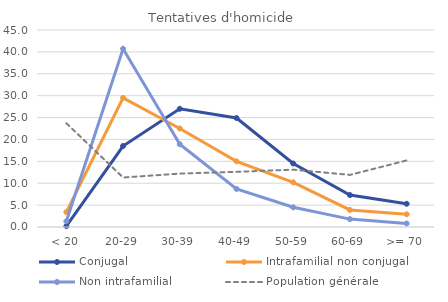
| Category | Conjugal | Intrafamilial non conjugal | Non intrafamilial | Population générale |
|---|---|---|---|---|
| < 20 | 0.2 | 3.4 | 1.3 | 23.7 |
| 20-29 | 18.5 | 29.5 | 40.7 | 11.3 |
| 30-39 | 27 | 22.5 | 18.9 | 12.2 |
| 40-49 | 24.9 | 15 | 8.7 | 12.6 |
| 50-59 | 14.5 | 10.2 | 4.5 | 13.1 |
| 60-69 | 7.3 | 3.9 | 1.8 | 11.9 |
| >= 70 | 5.3 | 2.9 | 0.8 | 15.2 |